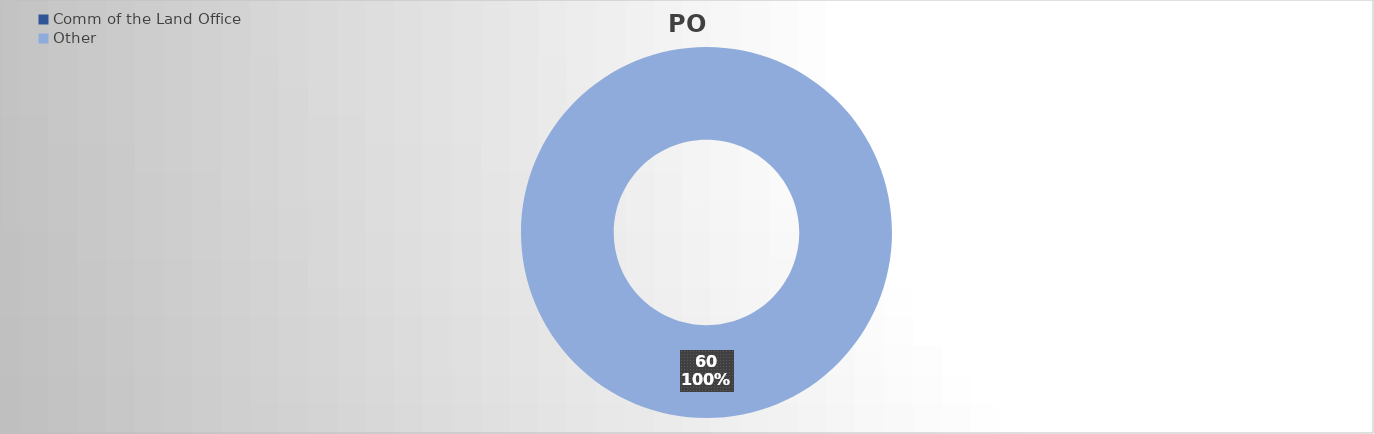
| Category | PO Lines |
|---|---|
| Comm of the Land Office | 0 |
| Other | 60 |